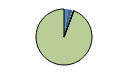
| Category | Series 0 |
|---|---|
| ARRASTRE | 72 |
| CERCO | 55 |
| ATUNEROS CAÑEROS | 15 |
| PALANGRE DE FONDO | 17 |
| PALANGRE DE SUPERFICIE | 1 |
| RASCO | 1 |
| VOLANTA | 1 |
| ARTES FIJAS | 2 |
| ARTES MENORES | 2712 |